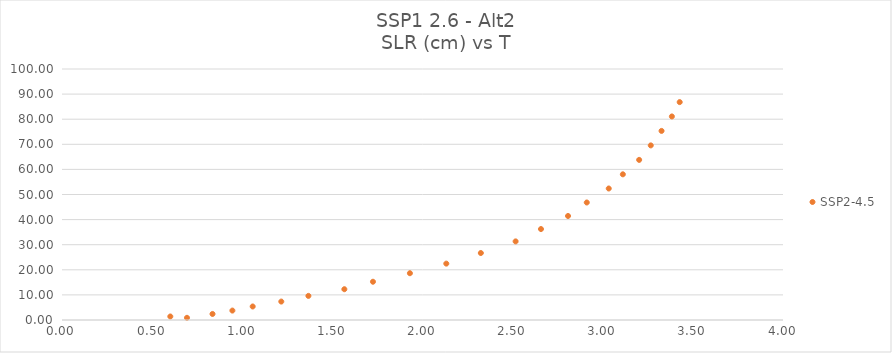
| Category | SSP2-4.5 |
|---|---|
| 0.693400617 | 0.87 |
| 0.600872844 | 1.399 |
| 0.835003234 | 2.407 |
| 0.945258389 | 3.755 |
| 1.057970477 | 5.386 |
| 1.216609042 | 7.344 |
| 1.366998793 | 9.606 |
| 1.566434093 | 12.264 |
| 1.725179017 | 15.242 |
| 1.930157664 | 18.64 |
| 2.132040838 | 22.46 |
| 2.323618479 | 26.685 |
| 2.516618438 | 31.321 |
| 2.657279805 | 36.235 |
| 2.807359279 | 41.443 |
| 2.911333711 | 46.815 |
| 3.033277846 | 52.391 |
| 3.111522119 | 58.041 |
| 3.201954144 | 63.791 |
| 3.266404687 | 69.562 |
| 3.326209687 | 75.334 |
| 3.383546807 | 81.097 |
| 3.426840742 | 86.808 |